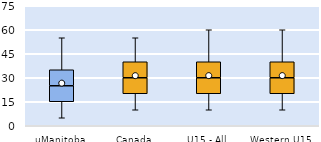
| Category | 25th | 50th | 75th |
|---|---|---|---|
| uManitoba | 15 | 10 | 10 |
| Canada | 20 | 10 | 10 |
| U15 - All | 20 | 10 | 10 |
| Western U15 | 20 | 10 | 10 |